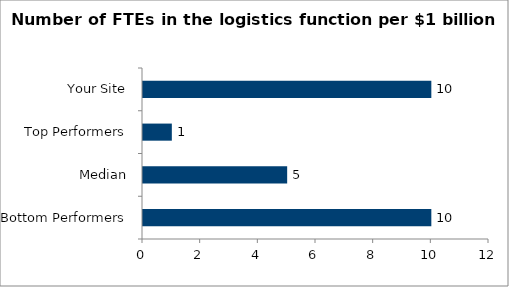
| Category | Series 0 |
|---|---|
| Bottom Performers | 10 |
| Median | 5 |
| Top Performers | 1 |
| Your Site | 10 |